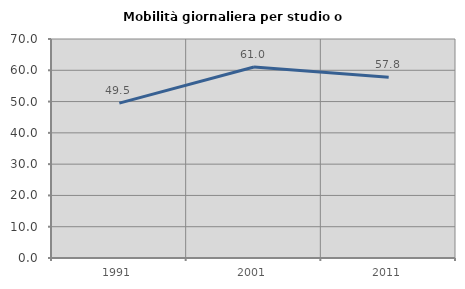
| Category | Mobilità giornaliera per studio o lavoro |
|---|---|
| 1991.0 | 49.495 |
| 2001.0 | 61.034 |
| 2011.0 | 57.806 |